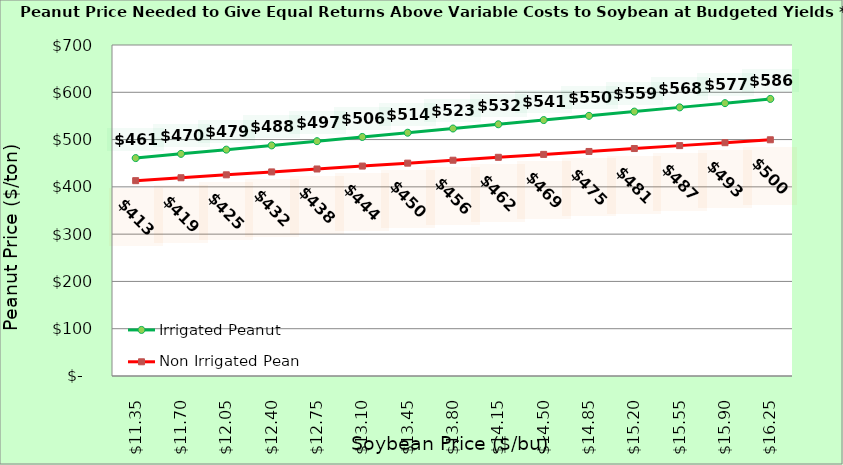
| Category | Irrigated Peanut | Non Irrigated Peanut |
|---|---|---|
| 11.350000000000003 | 460.847 | 413.087 |
| 11.700000000000003 | 469.783 | 419.263 |
| 12.050000000000002 | 478.719 | 425.44 |
| 12.400000000000002 | 487.656 | 431.616 |
| 12.750000000000002 | 496.592 | 437.792 |
| 13.100000000000001 | 505.528 | 443.969 |
| 13.450000000000001 | 514.464 | 450.145 |
| 13.8 | 523.4 | 456.322 |
| 14.15 | 532.337 | 462.498 |
| 14.5 | 541.273 | 468.675 |
| 14.85 | 550.209 | 474.851 |
| 15.2 | 559.145 | 481.028 |
| 15.549999999999999 | 568.081 | 487.204 |
| 15.899999999999999 | 577.017 | 493.381 |
| 16.25 | 585.954 | 499.557 |